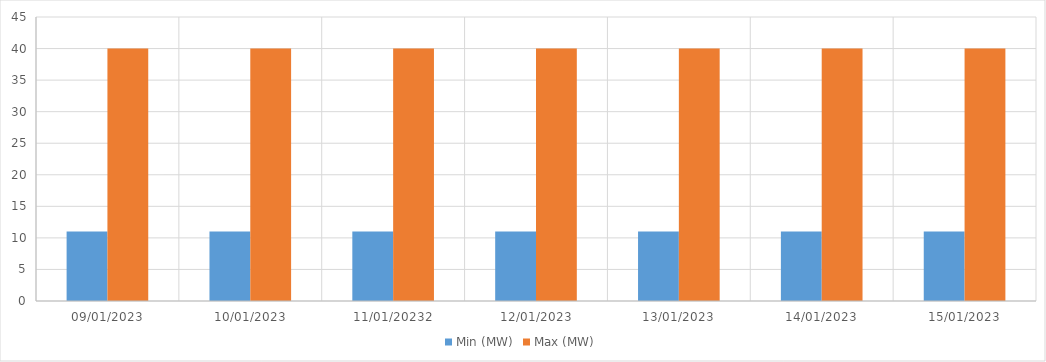
| Category | Min (MW) | Max (MW) |
|---|---|---|
| 09/01/2023 | 11 | 40 |
| 10/01/2023 | 11 | 40 |
| 11/01/20232 | 11 | 40 |
| 12/01/2023 | 11 | 40 |
| 13/01/2023 | 11 | 40 |
| 14/01/2023 | 11 | 40 |
| 15/01/2023 | 11 | 40 |